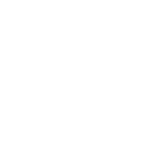
| Category | Series 0 |
|---|---|
| Career management | 0 |
| Continuing professional development | 0 |
| Responsiveness to opportunities | 0 |
| Networking | 0 |
| Reputation and esteem | 0 |